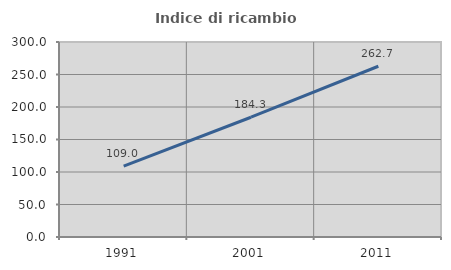
| Category | Indice di ricambio occupazionale  |
|---|---|
| 1991.0 | 109.034 |
| 2001.0 | 184.259 |
| 2011.0 | 262.708 |